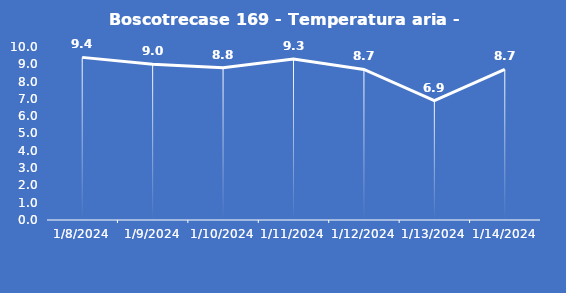
| Category | Boscotrecase 169 - Temperatura aria - Grezzo (°C) |
|---|---|
| 1/8/24 | 9.4 |
| 1/9/24 | 9 |
| 1/10/24 | 8.8 |
| 1/11/24 | 9.3 |
| 1/12/24 | 8.7 |
| 1/13/24 | 6.9 |
| 1/14/24 | 8.7 |